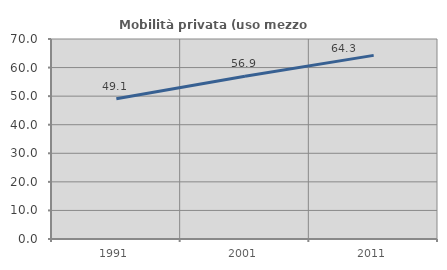
| Category | Mobilità privata (uso mezzo privato) |
|---|---|
| 1991.0 | 49.06 |
| 2001.0 | 56.945 |
| 2011.0 | 64.268 |